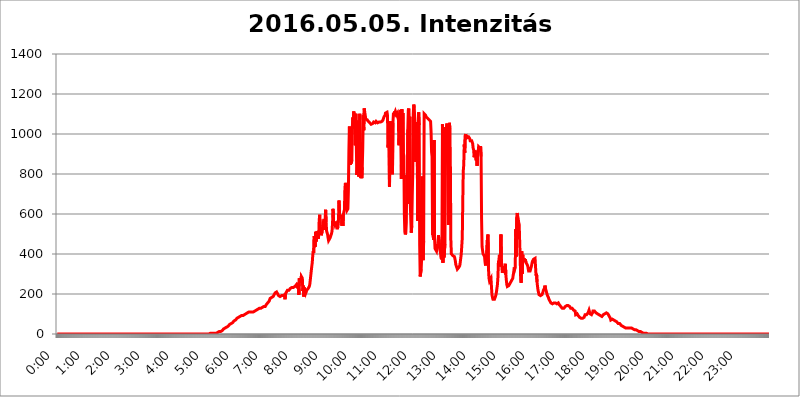
| Category | 2016.05.05. Intenzitás [W/m^2] |
|---|---|
| 0.0 | 0 |
| 0.0006944444444444445 | 0 |
| 0.001388888888888889 | 0 |
| 0.0020833333333333333 | 0 |
| 0.002777777777777778 | 0 |
| 0.003472222222222222 | 0 |
| 0.004166666666666667 | 0 |
| 0.004861111111111111 | 0 |
| 0.005555555555555556 | 0 |
| 0.0062499999999999995 | 0 |
| 0.006944444444444444 | 0 |
| 0.007638888888888889 | 0 |
| 0.008333333333333333 | 0 |
| 0.009027777777777779 | 0 |
| 0.009722222222222222 | 0 |
| 0.010416666666666666 | 0 |
| 0.011111111111111112 | 0 |
| 0.011805555555555555 | 0 |
| 0.012499999999999999 | 0 |
| 0.013194444444444444 | 0 |
| 0.013888888888888888 | 0 |
| 0.014583333333333332 | 0 |
| 0.015277777777777777 | 0 |
| 0.015972222222222224 | 0 |
| 0.016666666666666666 | 0 |
| 0.017361111111111112 | 0 |
| 0.018055555555555557 | 0 |
| 0.01875 | 0 |
| 0.019444444444444445 | 0 |
| 0.02013888888888889 | 0 |
| 0.020833333333333332 | 0 |
| 0.02152777777777778 | 0 |
| 0.022222222222222223 | 0 |
| 0.02291666666666667 | 0 |
| 0.02361111111111111 | 0 |
| 0.024305555555555556 | 0 |
| 0.024999999999999998 | 0 |
| 0.025694444444444447 | 0 |
| 0.02638888888888889 | 0 |
| 0.027083333333333334 | 0 |
| 0.027777777777777776 | 0 |
| 0.02847222222222222 | 0 |
| 0.029166666666666664 | 0 |
| 0.029861111111111113 | 0 |
| 0.030555555555555555 | 0 |
| 0.03125 | 0 |
| 0.03194444444444445 | 0 |
| 0.03263888888888889 | 0 |
| 0.03333333333333333 | 0 |
| 0.034027777777777775 | 0 |
| 0.034722222222222224 | 0 |
| 0.035416666666666666 | 0 |
| 0.036111111111111115 | 0 |
| 0.03680555555555556 | 0 |
| 0.0375 | 0 |
| 0.03819444444444444 | 0 |
| 0.03888888888888889 | 0 |
| 0.03958333333333333 | 0 |
| 0.04027777777777778 | 0 |
| 0.04097222222222222 | 0 |
| 0.041666666666666664 | 0 |
| 0.042361111111111106 | 0 |
| 0.04305555555555556 | 0 |
| 0.043750000000000004 | 0 |
| 0.044444444444444446 | 0 |
| 0.04513888888888889 | 0 |
| 0.04583333333333334 | 0 |
| 0.04652777777777778 | 0 |
| 0.04722222222222222 | 0 |
| 0.04791666666666666 | 0 |
| 0.04861111111111111 | 0 |
| 0.049305555555555554 | 0 |
| 0.049999999999999996 | 0 |
| 0.05069444444444445 | 0 |
| 0.051388888888888894 | 0 |
| 0.052083333333333336 | 0 |
| 0.05277777777777778 | 0 |
| 0.05347222222222222 | 0 |
| 0.05416666666666667 | 0 |
| 0.05486111111111111 | 0 |
| 0.05555555555555555 | 0 |
| 0.05625 | 0 |
| 0.05694444444444444 | 0 |
| 0.057638888888888885 | 0 |
| 0.05833333333333333 | 0 |
| 0.05902777777777778 | 0 |
| 0.059722222222222225 | 0 |
| 0.06041666666666667 | 0 |
| 0.061111111111111116 | 0 |
| 0.06180555555555556 | 0 |
| 0.0625 | 0 |
| 0.06319444444444444 | 0 |
| 0.06388888888888888 | 0 |
| 0.06458333333333334 | 0 |
| 0.06527777777777778 | 0 |
| 0.06597222222222222 | 0 |
| 0.06666666666666667 | 0 |
| 0.06736111111111111 | 0 |
| 0.06805555555555555 | 0 |
| 0.06874999999999999 | 0 |
| 0.06944444444444443 | 0 |
| 0.07013888888888889 | 0 |
| 0.07083333333333333 | 0 |
| 0.07152777777777779 | 0 |
| 0.07222222222222223 | 0 |
| 0.07291666666666667 | 0 |
| 0.07361111111111111 | 0 |
| 0.07430555555555556 | 0 |
| 0.075 | 0 |
| 0.07569444444444444 | 0 |
| 0.0763888888888889 | 0 |
| 0.07708333333333334 | 0 |
| 0.07777777777777778 | 0 |
| 0.07847222222222222 | 0 |
| 0.07916666666666666 | 0 |
| 0.0798611111111111 | 0 |
| 0.08055555555555556 | 0 |
| 0.08125 | 0 |
| 0.08194444444444444 | 0 |
| 0.08263888888888889 | 0 |
| 0.08333333333333333 | 0 |
| 0.08402777777777777 | 0 |
| 0.08472222222222221 | 0 |
| 0.08541666666666665 | 0 |
| 0.08611111111111112 | 0 |
| 0.08680555555555557 | 0 |
| 0.08750000000000001 | 0 |
| 0.08819444444444445 | 0 |
| 0.08888888888888889 | 0 |
| 0.08958333333333333 | 0 |
| 0.09027777777777778 | 0 |
| 0.09097222222222222 | 0 |
| 0.09166666666666667 | 0 |
| 0.09236111111111112 | 0 |
| 0.09305555555555556 | 0 |
| 0.09375 | 0 |
| 0.09444444444444444 | 0 |
| 0.09513888888888888 | 0 |
| 0.09583333333333333 | 0 |
| 0.09652777777777777 | 0 |
| 0.09722222222222222 | 0 |
| 0.09791666666666667 | 0 |
| 0.09861111111111111 | 0 |
| 0.09930555555555555 | 0 |
| 0.09999999999999999 | 0 |
| 0.10069444444444443 | 0 |
| 0.1013888888888889 | 0 |
| 0.10208333333333335 | 0 |
| 0.10277777777777779 | 0 |
| 0.10347222222222223 | 0 |
| 0.10416666666666667 | 0 |
| 0.10486111111111111 | 0 |
| 0.10555555555555556 | 0 |
| 0.10625 | 0 |
| 0.10694444444444444 | 0 |
| 0.1076388888888889 | 0 |
| 0.10833333333333334 | 0 |
| 0.10902777777777778 | 0 |
| 0.10972222222222222 | 0 |
| 0.1111111111111111 | 0 |
| 0.11180555555555556 | 0 |
| 0.11180555555555556 | 0 |
| 0.1125 | 0 |
| 0.11319444444444444 | 0 |
| 0.11388888888888889 | 0 |
| 0.11458333333333333 | 0 |
| 0.11527777777777777 | 0 |
| 0.11597222222222221 | 0 |
| 0.11666666666666665 | 0 |
| 0.1173611111111111 | 0 |
| 0.11805555555555557 | 0 |
| 0.11944444444444445 | 0 |
| 0.12013888888888889 | 0 |
| 0.12083333333333333 | 0 |
| 0.12152777777777778 | 0 |
| 0.12222222222222223 | 0 |
| 0.12291666666666667 | 0 |
| 0.12291666666666667 | 0 |
| 0.12361111111111112 | 0 |
| 0.12430555555555556 | 0 |
| 0.125 | 0 |
| 0.12569444444444444 | 0 |
| 0.12638888888888888 | 0 |
| 0.12708333333333333 | 0 |
| 0.16875 | 0 |
| 0.12847222222222224 | 0 |
| 0.12916666666666668 | 0 |
| 0.12986111111111112 | 0 |
| 0.13055555555555556 | 0 |
| 0.13125 | 0 |
| 0.13194444444444445 | 0 |
| 0.1326388888888889 | 0 |
| 0.13333333333333333 | 0 |
| 0.13402777777777777 | 0 |
| 0.13402777777777777 | 0 |
| 0.13472222222222222 | 0 |
| 0.13541666666666666 | 0 |
| 0.1361111111111111 | 0 |
| 0.13749999999999998 | 0 |
| 0.13819444444444443 | 0 |
| 0.1388888888888889 | 0 |
| 0.13958333333333334 | 0 |
| 0.14027777777777778 | 0 |
| 0.14097222222222222 | 0 |
| 0.14166666666666666 | 0 |
| 0.1423611111111111 | 0 |
| 0.14305555555555557 | 0 |
| 0.14375000000000002 | 0 |
| 0.14444444444444446 | 0 |
| 0.1451388888888889 | 0 |
| 0.1451388888888889 | 0 |
| 0.14652777777777778 | 0 |
| 0.14722222222222223 | 0 |
| 0.14791666666666667 | 0 |
| 0.1486111111111111 | 0 |
| 0.14930555555555555 | 0 |
| 0.15 | 0 |
| 0.15069444444444444 | 0 |
| 0.15138888888888888 | 0 |
| 0.15208333333333332 | 0 |
| 0.15277777777777776 | 0 |
| 0.15347222222222223 | 0 |
| 0.15416666666666667 | 0 |
| 0.15486111111111112 | 0 |
| 0.15555555555555556 | 0 |
| 0.15625 | 0 |
| 0.15694444444444444 | 0 |
| 0.15763888888888888 | 0 |
| 0.15833333333333333 | 0 |
| 0.15902777777777777 | 0 |
| 0.15972222222222224 | 0 |
| 0.16041666666666668 | 0 |
| 0.16111111111111112 | 0 |
| 0.16180555555555556 | 0 |
| 0.1625 | 0 |
| 0.16319444444444445 | 0 |
| 0.1638888888888889 | 0 |
| 0.16458333333333333 | 0 |
| 0.16527777777777777 | 0 |
| 0.16597222222222222 | 0 |
| 0.16666666666666666 | 0 |
| 0.1673611111111111 | 0 |
| 0.16805555555555554 | 0 |
| 0.16874999999999998 | 0 |
| 0.16944444444444443 | 0 |
| 0.17013888888888887 | 0 |
| 0.1708333333333333 | 0 |
| 0.17152777777777775 | 0 |
| 0.17222222222222225 | 0 |
| 0.1729166666666667 | 0 |
| 0.17361111111111113 | 0 |
| 0.17430555555555557 | 0 |
| 0.17500000000000002 | 0 |
| 0.17569444444444446 | 0 |
| 0.1763888888888889 | 0 |
| 0.17708333333333334 | 0 |
| 0.17777777777777778 | 0 |
| 0.17847222222222223 | 0 |
| 0.17916666666666667 | 0 |
| 0.1798611111111111 | 0 |
| 0.18055555555555555 | 0 |
| 0.18125 | 0 |
| 0.18194444444444444 | 0 |
| 0.1826388888888889 | 0 |
| 0.18333333333333335 | 0 |
| 0.1840277777777778 | 0 |
| 0.18472222222222223 | 0 |
| 0.18541666666666667 | 0 |
| 0.18611111111111112 | 0 |
| 0.18680555555555556 | 0 |
| 0.1875 | 0 |
| 0.18819444444444444 | 0 |
| 0.18888888888888888 | 0 |
| 0.18958333333333333 | 0 |
| 0.19027777777777777 | 0 |
| 0.1909722222222222 | 0 |
| 0.19166666666666665 | 0 |
| 0.19236111111111112 | 0 |
| 0.19305555555555554 | 0 |
| 0.19375 | 0 |
| 0.19444444444444445 | 0 |
| 0.1951388888888889 | 0 |
| 0.19583333333333333 | 0 |
| 0.19652777777777777 | 0 |
| 0.19722222222222222 | 0 |
| 0.19791666666666666 | 0 |
| 0.1986111111111111 | 0 |
| 0.19930555555555554 | 0 |
| 0.19999999999999998 | 0 |
| 0.20069444444444443 | 0 |
| 0.20138888888888887 | 0 |
| 0.2020833333333333 | 0 |
| 0.2027777777777778 | 0 |
| 0.2034722222222222 | 0 |
| 0.2041666666666667 | 0 |
| 0.20486111111111113 | 0 |
| 0.20555555555555557 | 0 |
| 0.20625000000000002 | 0 |
| 0.20694444444444446 | 0 |
| 0.2076388888888889 | 0 |
| 0.20833333333333334 | 0 |
| 0.20902777777777778 | 0 |
| 0.20972222222222223 | 0 |
| 0.21041666666666667 | 0 |
| 0.2111111111111111 | 0 |
| 0.21180555555555555 | 0 |
| 0.2125 | 0 |
| 0.21319444444444444 | 0 |
| 0.2138888888888889 | 3.525 |
| 0.21458333333333335 | 3.525 |
| 0.2152777777777778 | 3.525 |
| 0.21597222222222223 | 3.525 |
| 0.21666666666666667 | 3.525 |
| 0.21736111111111112 | 3.525 |
| 0.21805555555555556 | 0 |
| 0.21875 | 3.525 |
| 0.21944444444444444 | 0 |
| 0.22013888888888888 | 3.525 |
| 0.22083333333333333 | 3.525 |
| 0.22152777777777777 | 3.525 |
| 0.2222222222222222 | 3.525 |
| 0.22291666666666665 | 3.525 |
| 0.2236111111111111 | 7.887 |
| 0.22430555555555556 | 7.887 |
| 0.225 | 7.887 |
| 0.22569444444444445 | 7.887 |
| 0.2263888888888889 | 7.887 |
| 0.22708333333333333 | 12.257 |
| 0.22777777777777777 | 12.257 |
| 0.22847222222222222 | 12.257 |
| 0.22916666666666666 | 12.257 |
| 0.2298611111111111 | 16.636 |
| 0.23055555555555554 | 16.636 |
| 0.23124999999999998 | 16.636 |
| 0.23194444444444443 | 21.024 |
| 0.23263888888888887 | 21.024 |
| 0.2333333333333333 | 25.419 |
| 0.2340277777777778 | 25.419 |
| 0.2347222222222222 | 29.823 |
| 0.2354166666666667 | 29.823 |
| 0.23611111111111113 | 29.823 |
| 0.23680555555555557 | 34.234 |
| 0.23750000000000002 | 34.234 |
| 0.23819444444444446 | 34.234 |
| 0.2388888888888889 | 34.234 |
| 0.23958333333333334 | 38.653 |
| 0.24027777777777778 | 38.653 |
| 0.24097222222222223 | 43.079 |
| 0.24166666666666667 | 47.511 |
| 0.2423611111111111 | 47.511 |
| 0.24305555555555555 | 47.511 |
| 0.24375 | 51.951 |
| 0.24444444444444446 | 51.951 |
| 0.24513888888888888 | 56.398 |
| 0.24583333333333335 | 56.398 |
| 0.2465277777777778 | 56.398 |
| 0.24722222222222223 | 60.85 |
| 0.24791666666666667 | 65.31 |
| 0.24861111111111112 | 65.31 |
| 0.24930555555555556 | 69.775 |
| 0.25 | 69.775 |
| 0.25069444444444444 | 74.246 |
| 0.2513888888888889 | 74.246 |
| 0.2520833333333333 | 78.722 |
| 0.25277777777777777 | 78.722 |
| 0.2534722222222222 | 83.205 |
| 0.25416666666666665 | 83.205 |
| 0.2548611111111111 | 83.205 |
| 0.2555555555555556 | 87.692 |
| 0.25625000000000003 | 87.692 |
| 0.2569444444444445 | 87.692 |
| 0.2576388888888889 | 87.692 |
| 0.25833333333333336 | 92.184 |
| 0.2590277777777778 | 92.184 |
| 0.25972222222222224 | 92.184 |
| 0.2604166666666667 | 92.184 |
| 0.2611111111111111 | 92.184 |
| 0.26180555555555557 | 92.184 |
| 0.2625 | 96.682 |
| 0.26319444444444445 | 96.682 |
| 0.2638888888888889 | 101.184 |
| 0.26458333333333334 | 101.184 |
| 0.2652777777777778 | 101.184 |
| 0.2659722222222222 | 105.69 |
| 0.26666666666666666 | 105.69 |
| 0.2673611111111111 | 105.69 |
| 0.26805555555555555 | 105.69 |
| 0.26875 | 110.201 |
| 0.26944444444444443 | 110.201 |
| 0.2701388888888889 | 110.201 |
| 0.2708333333333333 | 110.201 |
| 0.27152777777777776 | 110.201 |
| 0.2722222222222222 | 110.201 |
| 0.27291666666666664 | 110.201 |
| 0.2736111111111111 | 110.201 |
| 0.2743055555555555 | 110.201 |
| 0.27499999999999997 | 110.201 |
| 0.27569444444444446 | 110.201 |
| 0.27638888888888885 | 114.716 |
| 0.27708333333333335 | 114.716 |
| 0.2777777777777778 | 114.716 |
| 0.27847222222222223 | 114.716 |
| 0.2791666666666667 | 119.235 |
| 0.2798611111111111 | 119.235 |
| 0.28055555555555556 | 119.235 |
| 0.28125 | 123.758 |
| 0.28194444444444444 | 123.758 |
| 0.2826388888888889 | 128.284 |
| 0.2833333333333333 | 128.284 |
| 0.28402777777777777 | 128.284 |
| 0.2847222222222222 | 128.284 |
| 0.28541666666666665 | 128.284 |
| 0.28611111111111115 | 132.814 |
| 0.28680555555555554 | 132.814 |
| 0.28750000000000003 | 132.814 |
| 0.2881944444444445 | 132.814 |
| 0.2888888888888889 | 137.347 |
| 0.28958333333333336 | 137.347 |
| 0.2902777777777778 | 137.347 |
| 0.29097222222222224 | 132.814 |
| 0.2916666666666667 | 137.347 |
| 0.2923611111111111 | 141.884 |
| 0.29305555555555557 | 146.423 |
| 0.29375 | 146.423 |
| 0.29444444444444445 | 150.964 |
| 0.2951388888888889 | 155.509 |
| 0.29583333333333334 | 155.509 |
| 0.2965277777777778 | 160.056 |
| 0.2972222222222222 | 164.605 |
| 0.29791666666666666 | 169.156 |
| 0.2986111111111111 | 178.264 |
| 0.29930555555555555 | 178.264 |
| 0.3 | 182.82 |
| 0.30069444444444443 | 182.82 |
| 0.3013888888888889 | 182.82 |
| 0.3020833333333333 | 187.378 |
| 0.30277777777777776 | 187.378 |
| 0.3034722222222222 | 191.937 |
| 0.30416666666666664 | 196.497 |
| 0.3048611111111111 | 201.058 |
| 0.3055555555555555 | 205.62 |
| 0.30624999999999997 | 210.182 |
| 0.3069444444444444 | 210.182 |
| 0.3076388888888889 | 210.182 |
| 0.30833333333333335 | 205.62 |
| 0.3090277777777778 | 201.058 |
| 0.30972222222222223 | 196.497 |
| 0.3104166666666667 | 191.937 |
| 0.3111111111111111 | 191.937 |
| 0.31180555555555556 | 191.937 |
| 0.3125 | 187.378 |
| 0.31319444444444444 | 187.378 |
| 0.3138888888888889 | 191.937 |
| 0.3145833333333333 | 191.937 |
| 0.31527777777777777 | 191.937 |
| 0.3159722222222222 | 191.937 |
| 0.31666666666666665 | 191.937 |
| 0.31736111111111115 | 191.937 |
| 0.31805555555555554 | 196.497 |
| 0.31875000000000003 | 196.497 |
| 0.3194444444444445 | 173.709 |
| 0.3201388888888889 | 201.058 |
| 0.32083333333333336 | 205.62 |
| 0.3215277777777778 | 210.182 |
| 0.32222222222222224 | 214.746 |
| 0.3229166666666667 | 219.309 |
| 0.3236111111111111 | 219.309 |
| 0.32430555555555557 | 219.309 |
| 0.325 | 219.309 |
| 0.32569444444444445 | 219.309 |
| 0.3263888888888889 | 223.873 |
| 0.32708333333333334 | 228.436 |
| 0.3277777777777778 | 233 |
| 0.3284722222222222 | 233 |
| 0.32916666666666666 | 233 |
| 0.3298611111111111 | 233 |
| 0.33055555555555555 | 233 |
| 0.33125 | 233 |
| 0.33194444444444443 | 233 |
| 0.3326388888888889 | 233 |
| 0.3333333333333333 | 237.564 |
| 0.3340277777777778 | 242.127 |
| 0.3347222222222222 | 242.127 |
| 0.3354166666666667 | 246.689 |
| 0.3361111111111111 | 251.251 |
| 0.3368055555555556 | 251.251 |
| 0.33749999999999997 | 228.436 |
| 0.33819444444444446 | 255.813 |
| 0.33888888888888885 | 196.497 |
| 0.33958333333333335 | 278.603 |
| 0.34027777777777773 | 283.156 |
| 0.34097222222222223 | 278.603 |
| 0.3416666666666666 | 255.813 |
| 0.3423611111111111 | 287.709 |
| 0.3430555555555555 | 287.709 |
| 0.34375 | 278.603 |
| 0.3444444444444445 | 214.746 |
| 0.3451388888888889 | 242.127 |
| 0.3458333333333334 | 187.378 |
| 0.34652777777777777 | 233 |
| 0.34722222222222227 | 201.058 |
| 0.34791666666666665 | 219.309 |
| 0.34861111111111115 | 205.62 |
| 0.34930555555555554 | 210.182 |
| 0.35000000000000003 | 219.309 |
| 0.3506944444444444 | 219.309 |
| 0.3513888888888889 | 223.873 |
| 0.3520833333333333 | 228.436 |
| 0.3527777777777778 | 228.436 |
| 0.3534722222222222 | 237.564 |
| 0.3541666666666667 | 246.689 |
| 0.3548611111111111 | 269.49 |
| 0.35555555555555557 | 292.259 |
| 0.35625 | 314.98 |
| 0.35694444444444445 | 337.639 |
| 0.3576388888888889 | 355.712 |
| 0.35833333333333334 | 391.685 |
| 0.3590277777777778 | 414.035 |
| 0.3597222222222222 | 405.108 |
| 0.36041666666666666 | 489.108 |
| 0.3611111111111111 | 471.582 |
| 0.36180555555555555 | 436.27 |
| 0.3625 | 510.885 |
| 0.36319444444444443 | 462.786 |
| 0.3638888888888889 | 484.735 |
| 0.3645833333333333 | 515.223 |
| 0.3652777777777778 | 497.836 |
| 0.3659722222222222 | 475.972 |
| 0.3666666666666667 | 489.108 |
| 0.3673611111111111 | 566.793 |
| 0.3680555555555556 | 596.45 |
| 0.36874999999999997 | 541.121 |
| 0.36944444444444446 | 528.2 |
| 0.37013888888888885 | 493.475 |
| 0.37083333333333335 | 497.836 |
| 0.37152777777777773 | 510.885 |
| 0.37222222222222223 | 515.223 |
| 0.3729166666666666 | 558.261 |
| 0.3736111111111111 | 562.53 |
| 0.3743055555555555 | 575.299 |
| 0.375 | 519.555 |
| 0.3756944444444445 | 571.049 |
| 0.3763888888888889 | 621.613 |
| 0.3770833333333334 | 558.261 |
| 0.37777777777777777 | 515.223 |
| 0.37847222222222227 | 515.223 |
| 0.37916666666666665 | 497.836 |
| 0.37986111111111115 | 480.356 |
| 0.38055555555555554 | 467.187 |
| 0.38125000000000003 | 462.786 |
| 0.3819444444444444 | 471.582 |
| 0.3826388888888889 | 480.356 |
| 0.3833333333333333 | 484.735 |
| 0.3840277777777778 | 484.735 |
| 0.3847222222222222 | 502.192 |
| 0.3854166666666667 | 515.223 |
| 0.3861111111111111 | 553.986 |
| 0.38680555555555557 | 625.784 |
| 0.3875 | 562.53 |
| 0.38819444444444445 | 558.261 |
| 0.3888888888888889 | 553.986 |
| 0.38958333333333334 | 545.416 |
| 0.3902777777777778 | 541.121 |
| 0.3909722222222222 | 562.53 |
| 0.39166666666666666 | 566.793 |
| 0.3923611111111111 | 541.121 |
| 0.39305555555555555 | 523.88 |
| 0.39375 | 523.88 |
| 0.39444444444444443 | 575.299 |
| 0.3951388888888889 | 667.123 |
| 0.3958333333333333 | 604.864 |
| 0.3965277777777778 | 575.299 |
| 0.3972222222222222 | 592.233 |
| 0.3979166666666667 | 575.299 |
| 0.3986111111111111 | 596.45 |
| 0.3993055555555556 | 541.121 |
| 0.39999999999999997 | 571.049 |
| 0.40069444444444446 | 541.121 |
| 0.40138888888888885 | 600.661 |
| 0.40208333333333335 | 596.45 |
| 0.40277777777777773 | 621.613 |
| 0.40347222222222223 | 727.896 |
| 0.4041666666666666 | 755.766 |
| 0.4048611111111111 | 731.896 |
| 0.4055555555555555 | 629.948 |
| 0.40625 | 617.436 |
| 0.4069444444444445 | 617.436 |
| 0.4076388888888889 | 625.784 |
| 0.4083333333333334 | 715.858 |
| 0.40902777777777777 | 913.766 |
| 0.40972222222222227 | 1037.277 |
| 0.41041666666666665 | 932.576 |
| 0.41111111111111115 | 845.365 |
| 0.41180555555555554 | 940.082 |
| 0.41250000000000003 | 853.029 |
| 0.4131944444444444 | 872.114 |
| 0.4138888888888889 | 1037.277 |
| 0.4145833333333333 | 1082.324 |
| 0.4152777777777778 | 1026.06 |
| 0.4159722222222222 | 1112.618 |
| 0.4166666666666667 | 1044.762 |
| 0.4173611111111111 | 1086.097 |
| 0.41805555555555557 | 943.832 |
| 0.41875 | 1101.226 |
| 0.41944444444444445 | 947.58 |
| 0.4201388888888889 | 795.074 |
| 0.42083333333333334 | 833.834 |
| 0.4215277777777778 | 1026.06 |
| 0.4222222222222222 | 1067.267 |
| 0.42291666666666666 | 787.258 |
| 0.4236111111111111 | 973.772 |
| 0.42430555555555555 | 1101.226 |
| 0.425 | 943.832 |
| 0.42569444444444443 | 779.42 |
| 0.4263888888888889 | 958.814 |
| 0.4270833333333333 | 779.42 |
| 0.4277777777777778 | 833.834 |
| 0.4284722222222222 | 928.819 |
| 0.4291666666666667 | 1093.653 |
| 0.4298611111111111 | 1018.587 |
| 0.4305555555555556 | 1127.879 |
| 0.43124999999999997 | 1108.816 |
| 0.43194444444444446 | 1093.653 |
| 0.43263888888888885 | 1074.789 |
| 0.43333333333333335 | 1078.555 |
| 0.43402777777777773 | 1071.027 |
| 0.43472222222222223 | 1071.027 |
| 0.4354166666666666 | 1067.267 |
| 0.4361111111111111 | 1063.51 |
| 0.4368055555555555 | 1059.756 |
| 0.4375 | 1059.756 |
| 0.4381944444444445 | 1056.004 |
| 0.4388888888888889 | 1059.756 |
| 0.4395833333333334 | 1056.004 |
| 0.44027777777777777 | 1048.508 |
| 0.44097222222222227 | 1044.762 |
| 0.44166666666666665 | 1048.508 |
| 0.44236111111111115 | 1052.255 |
| 0.44305555555555554 | 1056.004 |
| 0.44375000000000003 | 1059.756 |
| 0.4444444444444444 | 1059.756 |
| 0.4451388888888889 | 1059.756 |
| 0.4458333333333333 | 1056.004 |
| 0.4465277777777778 | 1059.756 |
| 0.4472222222222222 | 1063.51 |
| 0.4479166666666667 | 1059.756 |
| 0.4486111111111111 | 1059.756 |
| 0.44930555555555557 | 1056.004 |
| 0.45 | 1056.004 |
| 0.45069444444444445 | 1059.756 |
| 0.4513888888888889 | 1059.756 |
| 0.45208333333333334 | 1059.756 |
| 0.4527777777777778 | 1059.756 |
| 0.4534722222222222 | 1059.756 |
| 0.45416666666666666 | 1059.756 |
| 0.4548611111111111 | 1059.756 |
| 0.45555555555555555 | 1063.51 |
| 0.45625 | 1063.51 |
| 0.45694444444444443 | 1071.027 |
| 0.4576388888888889 | 1078.555 |
| 0.4583333333333333 | 1086.097 |
| 0.4590277777777778 | 1089.873 |
| 0.4597222222222222 | 1093.653 |
| 0.4604166666666667 | 1105.019 |
| 0.4611111111111111 | 1108.816 |
| 0.4618055555555556 | 1108.816 |
| 0.46249999999999997 | 1108.816 |
| 0.46319444444444446 | 1093.653 |
| 0.46388888888888885 | 932.576 |
| 0.46458333333333335 | 984.98 |
| 0.46527777777777773 | 1011.118 |
| 0.46597222222222223 | 735.89 |
| 0.4666666666666666 | 955.071 |
| 0.4673611111111111 | 1063.51 |
| 0.4680555555555555 | 999.916 |
| 0.46875 | 1007.383 |
| 0.4694444444444445 | 1048.508 |
| 0.4701388888888889 | 798.974 |
| 0.4708333333333334 | 1056.004 |
| 0.47152777777777777 | 1105.019 |
| 0.47222222222222227 | 1089.873 |
| 0.47291666666666665 | 1112.618 |
| 0.47361111111111115 | 1105.019 |
| 0.47430555555555554 | 1112.618 |
| 0.47500000000000003 | 1108.816 |
| 0.4756944444444444 | 1097.437 |
| 0.4763888888888889 | 1101.226 |
| 0.4770833333333333 | 1105.019 |
| 0.4777777777777778 | 1082.324 |
| 0.4784722222222222 | 1071.027 |
| 0.4791666666666667 | 943.832 |
| 0.4798611111111111 | 1014.852 |
| 0.48055555555555557 | 1108.816 |
| 0.48125 | 1120.238 |
| 0.48194444444444445 | 951.327 |
| 0.4826388888888889 | 775.492 |
| 0.48333333333333334 | 1124.056 |
| 0.4840277777777778 | 894.885 |
| 0.4847222222222222 | 1105.019 |
| 0.48541666666666666 | 906.223 |
| 0.4861111111111111 | 891.099 |
| 0.48680555555555555 | 600.661 |
| 0.4875 | 510.885 |
| 0.48819444444444443 | 497.836 |
| 0.4888888888888889 | 506.542 |
| 0.4895833333333333 | 558.261 |
| 0.4902777777777778 | 795.074 |
| 0.4909722222222222 | 650.667 |
| 0.4916666666666667 | 1022.323 |
| 0.4923611111111111 | 1120.238 |
| 0.4930555555555556 | 1127.879 |
| 0.49374999999999997 | 887.309 |
| 0.49444444444444446 | 1086.097 |
| 0.49513888888888885 | 654.791 |
| 0.49583333333333335 | 575.299 |
| 0.49652777777777773 | 506.542 |
| 0.49722222222222223 | 541.121 |
| 0.4979166666666666 | 691.608 |
| 0.4986111111111111 | 806.757 |
| 0.4993055555555555 | 1101.226 |
| 0.5 | 1147.086 |
| 0.5006944444444444 | 1131.708 |
| 0.5013888888888889 | 1078.555 |
| 0.5020833333333333 | 917.534 |
| 0.5027777777777778 | 860.676 |
| 0.5034722222222222 | 1059.756 |
| 0.5041666666666667 | 996.182 |
| 0.5048611111111111 | 1022.323 |
| 0.5055555555555555 | 566.793 |
| 0.50625 | 1059.756 |
| 0.5069444444444444 | 1108.816 |
| 0.5076388888888889 | 1044.762 |
| 0.5083333333333333 | 440.702 |
| 0.5090277777777777 | 287.709 |
| 0.5097222222222222 | 292.259 |
| 0.5104166666666666 | 324.052 |
| 0.5111111111111112 | 382.715 |
| 0.5118055555555555 | 787.258 |
| 0.5125000000000001 | 449.551 |
| 0.5131944444444444 | 369.23 |
| 0.513888888888889 | 462.786 |
| 0.5145833333333333 | 1101.226 |
| 0.5152777777777778 | 1101.226 |
| 0.5159722222222222 | 1097.437 |
| 0.5166666666666667 | 1093.653 |
| 0.517361111111111 | 1086.097 |
| 0.5180555555555556 | 1086.097 |
| 0.5187499999999999 | 1082.324 |
| 0.5194444444444445 | 1078.555 |
| 0.5201388888888888 | 1074.789 |
| 0.5208333333333334 | 1074.789 |
| 0.5215277777777778 | 1071.027 |
| 0.5222222222222223 | 1071.027 |
| 0.5229166666666667 | 1074.789 |
| 0.5236111111111111 | 1063.51 |
| 0.5243055555555556 | 1011.118 |
| 0.525 | 909.996 |
| 0.5256944444444445 | 887.309 |
| 0.5263888888888889 | 493.475 |
| 0.5270833333333333 | 502.192 |
| 0.5277777777777778 | 471.582 |
| 0.5284722222222222 | 970.034 |
| 0.5291666666666667 | 480.356 |
| 0.5298611111111111 | 427.39 |
| 0.5305555555555556 | 431.833 |
| 0.53125 | 422.943 |
| 0.5319444444444444 | 414.035 |
| 0.5326388888888889 | 431.833 |
| 0.5333333333333333 | 436.27 |
| 0.5340277777777778 | 453.968 |
| 0.5347222222222222 | 493.475 |
| 0.5354166666666667 | 489.108 |
| 0.5361111111111111 | 431.833 |
| 0.5368055555555555 | 418.492 |
| 0.5375 | 405.108 |
| 0.5381944444444444 | 382.715 |
| 0.5388888888888889 | 373.729 |
| 0.5395833333333333 | 475.972 |
| 0.5402777777777777 | 1048.508 |
| 0.5409722222222222 | 355.712 |
| 0.5416666666666666 | 1033.537 |
| 0.5423611111111112 | 382.715 |
| 0.5430555555555555 | 378.224 |
| 0.5437500000000001 | 449.551 |
| 0.5444444444444444 | 970.034 |
| 0.545138888888889 | 992.448 |
| 0.5458333333333333 | 1029.798 |
| 0.5465277777777778 | 1052.255 |
| 0.5472222222222222 | 879.719 |
| 0.5479166666666667 | 787.258 |
| 0.548611111111111 | 545.416 |
| 0.5493055555555556 | 650.667 |
| 0.5499999999999999 | 1056.004 |
| 0.5506944444444445 | 1026.06 |
| 0.5513888888888888 | 833.834 |
| 0.5520833333333334 | 462.786 |
| 0.5527777777777778 | 400.638 |
| 0.5534722222222223 | 400.638 |
| 0.5541666666666667 | 396.164 |
| 0.5548611111111111 | 391.685 |
| 0.5555555555555556 | 391.685 |
| 0.55625 | 396.164 |
| 0.5569444444444445 | 387.202 |
| 0.5576388888888889 | 378.224 |
| 0.5583333333333333 | 364.728 |
| 0.5590277777777778 | 346.682 |
| 0.5597222222222222 | 342.162 |
| 0.5604166666666667 | 342.162 |
| 0.5611111111111111 | 324.052 |
| 0.5618055555555556 | 324.052 |
| 0.5625 | 324.052 |
| 0.5631944444444444 | 333.113 |
| 0.5638888888888889 | 333.113 |
| 0.5645833333333333 | 342.162 |
| 0.5652777777777778 | 360.221 |
| 0.5659722222222222 | 360.221 |
| 0.5666666666666667 | 400.638 |
| 0.5673611111111111 | 440.702 |
| 0.5680555555555555 | 480.356 |
| 0.56875 | 658.909 |
| 0.5694444444444444 | 814.519 |
| 0.5701388888888889 | 845.365 |
| 0.5708333333333333 | 947.58 |
| 0.5715277777777777 | 906.223 |
| 0.5722222222222222 | 992.448 |
| 0.5729166666666666 | 999.916 |
| 0.5736111111111112 | 977.508 |
| 0.5743055555555555 | 992.448 |
| 0.5750000000000001 | 981.244 |
| 0.5756944444444444 | 984.98 |
| 0.576388888888889 | 977.508 |
| 0.5770833333333333 | 984.98 |
| 0.5777777777777778 | 981.244 |
| 0.5784722222222222 | 977.508 |
| 0.5791666666666667 | 966.295 |
| 0.579861111111111 | 970.034 |
| 0.5805555555555556 | 970.034 |
| 0.5812499999999999 | 966.295 |
| 0.5819444444444445 | 958.814 |
| 0.5826388888888888 | 951.327 |
| 0.5833333333333334 | 928.819 |
| 0.5840277777777778 | 921.298 |
| 0.5847222222222223 | 883.516 |
| 0.5854166666666667 | 879.719 |
| 0.5861111111111111 | 917.534 |
| 0.5868055555555556 | 887.309 |
| 0.5875 | 868.305 |
| 0.5881944444444445 | 891.099 |
| 0.5888888888888889 | 841.526 |
| 0.5895833333333333 | 894.885 |
| 0.5902777777777778 | 909.996 |
| 0.5909722222222222 | 936.33 |
| 0.5916666666666667 | 940.082 |
| 0.5923611111111111 | 936.33 |
| 0.5930555555555556 | 928.819 |
| 0.59375 | 940.082 |
| 0.5944444444444444 | 887.309 |
| 0.5951388888888889 | 575.299 |
| 0.5958333333333333 | 436.27 |
| 0.5965277777777778 | 440.702 |
| 0.5972222222222222 | 400.638 |
| 0.5979166666666667 | 396.164 |
| 0.5986111111111111 | 400.638 |
| 0.5993055555555555 | 387.202 |
| 0.6 | 360.221 |
| 0.6006944444444444 | 342.162 |
| 0.6013888888888889 | 396.164 |
| 0.6020833333333333 | 382.715 |
| 0.6027777777777777 | 378.224 |
| 0.6034722222222222 | 484.735 |
| 0.6041666666666666 | 497.836 |
| 0.6048611111111112 | 324.052 |
| 0.6055555555555555 | 278.603 |
| 0.6062500000000001 | 264.932 |
| 0.6069444444444444 | 260.373 |
| 0.607638888888889 | 260.373 |
| 0.6083333333333333 | 278.603 |
| 0.6090277777777778 | 233 |
| 0.6097222222222222 | 196.497 |
| 0.6104166666666667 | 182.82 |
| 0.611111111111111 | 173.709 |
| 0.6118055555555556 | 169.156 |
| 0.6124999999999999 | 169.156 |
| 0.6131944444444445 | 173.709 |
| 0.6138888888888888 | 178.264 |
| 0.6145833333333334 | 187.378 |
| 0.6152777777777778 | 196.497 |
| 0.6159722222222223 | 210.182 |
| 0.6166666666666667 | 228.436 |
| 0.6173611111111111 | 246.689 |
| 0.6180555555555556 | 283.156 |
| 0.61875 | 360.221 |
| 0.6194444444444445 | 369.23 |
| 0.6201388888888889 | 396.164 |
| 0.6208333333333333 | 378.224 |
| 0.6215277777777778 | 337.639 |
| 0.6222222222222222 | 497.836 |
| 0.6229166666666667 | 369.23 |
| 0.6236111111111111 | 333.113 |
| 0.6243055555555556 | 305.898 |
| 0.625 | 301.354 |
| 0.6256944444444444 | 324.052 |
| 0.6263888888888889 | 328.584 |
| 0.6270833333333333 | 314.98 |
| 0.6277777777777778 | 319.517 |
| 0.6284722222222222 | 351.198 |
| 0.6291666666666667 | 296.808 |
| 0.6298611111111111 | 269.49 |
| 0.6305555555555555 | 246.689 |
| 0.63125 | 237.564 |
| 0.6319444444444444 | 233 |
| 0.6326388888888889 | 237.564 |
| 0.6333333333333333 | 242.127 |
| 0.6340277777777777 | 242.127 |
| 0.6347222222222222 | 242.127 |
| 0.6354166666666666 | 255.813 |
| 0.6361111111111112 | 260.373 |
| 0.6368055555555555 | 260.373 |
| 0.6375000000000001 | 269.49 |
| 0.6381944444444444 | 274.047 |
| 0.638888888888889 | 278.603 |
| 0.6395833333333333 | 296.808 |
| 0.6402777777777778 | 310.44 |
| 0.6409722222222222 | 333.113 |
| 0.6416666666666667 | 324.052 |
| 0.642361111111111 | 333.113 |
| 0.6430555555555556 | 523.88 |
| 0.6437499999999999 | 387.202 |
| 0.6444444444444445 | 583.779 |
| 0.6451388888888888 | 604.864 |
| 0.6458333333333334 | 588.009 |
| 0.6465277777777778 | 575.299 |
| 0.6472222222222223 | 558.261 |
| 0.6479166666666667 | 545.416 |
| 0.6486111111111111 | 458.38 |
| 0.6493055555555556 | 378.224 |
| 0.65 | 274.047 |
| 0.6506944444444445 | 255.813 |
| 0.6513888888888889 | 414.035 |
| 0.6520833333333333 | 301.354 |
| 0.6527777777777778 | 396.164 |
| 0.6534722222222222 | 369.23 |
| 0.6541666666666667 | 360.221 |
| 0.6548611111111111 | 378.224 |
| 0.6555555555555556 | 360.221 |
| 0.65625 | 373.729 |
| 0.6569444444444444 | 369.23 |
| 0.6576388888888889 | 355.712 |
| 0.6583333333333333 | 355.712 |
| 0.6590277777777778 | 351.198 |
| 0.6597222222222222 | 342.162 |
| 0.6604166666666667 | 337.639 |
| 0.6611111111111111 | 314.98 |
| 0.6618055555555555 | 314.98 |
| 0.6625 | 310.44 |
| 0.6631944444444444 | 314.98 |
| 0.6638888888888889 | 319.517 |
| 0.6645833333333333 | 333.113 |
| 0.6652777777777777 | 342.162 |
| 0.6659722222222222 | 355.712 |
| 0.6666666666666666 | 364.728 |
| 0.6673611111111111 | 364.728 |
| 0.6680555555555556 | 373.729 |
| 0.6687500000000001 | 373.729 |
| 0.6694444444444444 | 373.729 |
| 0.6701388888888888 | 378.224 |
| 0.6708333333333334 | 373.729 |
| 0.6715277777777778 | 292.259 |
| 0.6722222222222222 | 301.354 |
| 0.6729166666666666 | 260.373 |
| 0.6736111111111112 | 237.564 |
| 0.6743055555555556 | 219.309 |
| 0.6749999999999999 | 219.309 |
| 0.6756944444444444 | 196.497 |
| 0.6763888888888889 | 191.937 |
| 0.6770833333333334 | 191.937 |
| 0.6777777777777777 | 191.937 |
| 0.6784722222222223 | 196.497 |
| 0.6791666666666667 | 196.497 |
| 0.6798611111111111 | 196.497 |
| 0.6805555555555555 | 201.058 |
| 0.68125 | 210.182 |
| 0.6819444444444445 | 219.309 |
| 0.6826388888888889 | 223.873 |
| 0.6833333333333332 | 228.436 |
| 0.6840277777777778 | 242.127 |
| 0.6847222222222222 | 228.436 |
| 0.6854166666666667 | 219.309 |
| 0.686111111111111 | 210.182 |
| 0.6868055555555556 | 201.058 |
| 0.6875 | 191.937 |
| 0.6881944444444444 | 187.378 |
| 0.688888888888889 | 182.82 |
| 0.6895833333333333 | 173.709 |
| 0.6902777777777778 | 169.156 |
| 0.6909722222222222 | 164.605 |
| 0.6916666666666668 | 160.056 |
| 0.6923611111111111 | 155.509 |
| 0.6930555555555555 | 150.964 |
| 0.69375 | 150.964 |
| 0.6944444444444445 | 150.964 |
| 0.6951388888888889 | 150.964 |
| 0.6958333333333333 | 150.964 |
| 0.6965277777777777 | 155.509 |
| 0.6972222222222223 | 150.964 |
| 0.6979166666666666 | 155.509 |
| 0.6986111111111111 | 155.509 |
| 0.6993055555555556 | 155.509 |
| 0.7000000000000001 | 155.509 |
| 0.7006944444444444 | 150.964 |
| 0.7013888888888888 | 150.964 |
| 0.7020833333333334 | 155.509 |
| 0.7027777777777778 | 155.509 |
| 0.7034722222222222 | 150.964 |
| 0.7041666666666666 | 146.423 |
| 0.7048611111111112 | 146.423 |
| 0.7055555555555556 | 141.884 |
| 0.7062499999999999 | 137.347 |
| 0.7069444444444444 | 137.347 |
| 0.7076388888888889 | 132.814 |
| 0.7083333333333334 | 128.284 |
| 0.7090277777777777 | 128.284 |
| 0.7097222222222223 | 128.284 |
| 0.7104166666666667 | 128.284 |
| 0.7111111111111111 | 128.284 |
| 0.7118055555555555 | 132.814 |
| 0.7125 | 137.347 |
| 0.7131944444444445 | 137.347 |
| 0.7138888888888889 | 141.884 |
| 0.7145833333333332 | 141.884 |
| 0.7152777777777778 | 141.884 |
| 0.7159722222222222 | 141.884 |
| 0.7166666666666667 | 141.884 |
| 0.717361111111111 | 141.884 |
| 0.7180555555555556 | 141.884 |
| 0.71875 | 137.347 |
| 0.7194444444444444 | 132.814 |
| 0.720138888888889 | 128.284 |
| 0.7208333333333333 | 128.284 |
| 0.7215277777777778 | 128.284 |
| 0.7222222222222222 | 128.284 |
| 0.7229166666666668 | 128.284 |
| 0.7236111111111111 | 123.758 |
| 0.7243055555555555 | 119.235 |
| 0.725 | 114.716 |
| 0.7256944444444445 | 114.716 |
| 0.7263888888888889 | 114.716 |
| 0.7270833333333333 | 96.682 |
| 0.7277777777777777 | 96.682 |
| 0.7284722222222223 | 101.184 |
| 0.7291666666666666 | 101.184 |
| 0.7298611111111111 | 96.682 |
| 0.7305555555555556 | 92.184 |
| 0.7312500000000001 | 92.184 |
| 0.7319444444444444 | 87.692 |
| 0.7326388888888888 | 83.205 |
| 0.7333333333333334 | 78.722 |
| 0.7340277777777778 | 78.722 |
| 0.7347222222222222 | 78.722 |
| 0.7354166666666666 | 74.246 |
| 0.7361111111111112 | 74.246 |
| 0.7368055555555556 | 78.722 |
| 0.7374999999999999 | 78.722 |
| 0.7381944444444444 | 83.205 |
| 0.7388888888888889 | 83.205 |
| 0.7395833333333334 | 87.692 |
| 0.7402777777777777 | 96.682 |
| 0.7409722222222223 | 101.184 |
| 0.7416666666666667 | 92.184 |
| 0.7423611111111111 | 96.682 |
| 0.7430555555555555 | 101.184 |
| 0.74375 | 101.184 |
| 0.7444444444444445 | 105.69 |
| 0.7451388888888889 | 105.69 |
| 0.7458333333333332 | 119.235 |
| 0.7465277777777778 | 119.235 |
| 0.7472222222222222 | 101.184 |
| 0.7479166666666667 | 96.682 |
| 0.748611111111111 | 96.682 |
| 0.7493055555555556 | 96.682 |
| 0.75 | 96.682 |
| 0.7506944444444444 | 105.69 |
| 0.751388888888889 | 114.716 |
| 0.7520833333333333 | 114.716 |
| 0.7527777777777778 | 114.716 |
| 0.7534722222222222 | 114.716 |
| 0.7541666666666668 | 110.201 |
| 0.7548611111111111 | 110.201 |
| 0.7555555555555555 | 105.69 |
| 0.75625 | 105.69 |
| 0.7569444444444445 | 101.184 |
| 0.7576388888888889 | 101.184 |
| 0.7583333333333333 | 101.184 |
| 0.7590277777777777 | 96.682 |
| 0.7597222222222223 | 96.682 |
| 0.7604166666666666 | 96.682 |
| 0.7611111111111111 | 92.184 |
| 0.7618055555555556 | 92.184 |
| 0.7625000000000001 | 92.184 |
| 0.7631944444444444 | 87.692 |
| 0.7638888888888888 | 87.692 |
| 0.7645833333333334 | 87.692 |
| 0.7652777777777778 | 92.184 |
| 0.7659722222222222 | 96.682 |
| 0.7666666666666666 | 96.682 |
| 0.7673611111111112 | 101.184 |
| 0.7680555555555556 | 101.184 |
| 0.7687499999999999 | 101.184 |
| 0.7694444444444444 | 105.69 |
| 0.7701388888888889 | 105.69 |
| 0.7708333333333334 | 101.184 |
| 0.7715277777777777 | 101.184 |
| 0.7722222222222223 | 101.184 |
| 0.7729166666666667 | 96.682 |
| 0.7736111111111111 | 92.184 |
| 0.7743055555555555 | 92.184 |
| 0.775 | 87.692 |
| 0.7756944444444445 | 78.722 |
| 0.7763888888888889 | 69.775 |
| 0.7770833333333332 | 74.246 |
| 0.7777777777777778 | 74.246 |
| 0.7784722222222222 | 74.246 |
| 0.7791666666666667 | 74.246 |
| 0.779861111111111 | 69.775 |
| 0.7805555555555556 | 69.775 |
| 0.78125 | 69.775 |
| 0.7819444444444444 | 65.31 |
| 0.782638888888889 | 65.31 |
| 0.7833333333333333 | 65.31 |
| 0.7840277777777778 | 65.31 |
| 0.7847222222222222 | 60.85 |
| 0.7854166666666668 | 56.398 |
| 0.7861111111111111 | 56.398 |
| 0.7868055555555555 | 51.951 |
| 0.7875 | 51.951 |
| 0.7881944444444445 | 51.951 |
| 0.7888888888888889 | 51.951 |
| 0.7895833333333333 | 47.511 |
| 0.7902777777777777 | 47.511 |
| 0.7909722222222223 | 43.079 |
| 0.7916666666666666 | 43.079 |
| 0.7923611111111111 | 38.653 |
| 0.7930555555555556 | 38.653 |
| 0.7937500000000001 | 38.653 |
| 0.7944444444444444 | 38.653 |
| 0.7951388888888888 | 34.234 |
| 0.7958333333333334 | 34.234 |
| 0.7965277777777778 | 34.234 |
| 0.7972222222222222 | 29.823 |
| 0.7979166666666666 | 29.823 |
| 0.7986111111111112 | 29.823 |
| 0.7993055555555556 | 29.823 |
| 0.7999999999999999 | 29.823 |
| 0.8006944444444444 | 29.823 |
| 0.8013888888888889 | 29.823 |
| 0.8020833333333334 | 29.823 |
| 0.8027777777777777 | 29.823 |
| 0.8034722222222223 | 29.823 |
| 0.8041666666666667 | 29.823 |
| 0.8048611111111111 | 29.823 |
| 0.8055555555555555 | 29.823 |
| 0.80625 | 25.419 |
| 0.8069444444444445 | 25.419 |
| 0.8076388888888889 | 25.419 |
| 0.8083333333333332 | 25.419 |
| 0.8090277777777778 | 21.024 |
| 0.8097222222222222 | 21.024 |
| 0.8104166666666667 | 21.024 |
| 0.811111111111111 | 21.024 |
| 0.8118055555555556 | 21.024 |
| 0.8125 | 16.636 |
| 0.8131944444444444 | 16.636 |
| 0.813888888888889 | 16.636 |
| 0.8145833333333333 | 12.257 |
| 0.8152777777777778 | 12.257 |
| 0.8159722222222222 | 12.257 |
| 0.8166666666666668 | 12.257 |
| 0.8173611111111111 | 12.257 |
| 0.8180555555555555 | 12.257 |
| 0.81875 | 7.887 |
| 0.8194444444444445 | 7.887 |
| 0.8201388888888889 | 7.887 |
| 0.8208333333333333 | 7.887 |
| 0.8215277777777777 | 7.887 |
| 0.8222222222222223 | 3.525 |
| 0.8229166666666666 | 3.525 |
| 0.8236111111111111 | 3.525 |
| 0.8243055555555556 | 3.525 |
| 0.8250000000000001 | 3.525 |
| 0.8256944444444444 | 3.525 |
| 0.8263888888888888 | 3.525 |
| 0.8270833333333334 | 3.525 |
| 0.8277777777777778 | 0 |
| 0.8284722222222222 | 0 |
| 0.8291666666666666 | 0 |
| 0.8298611111111112 | 0 |
| 0.8305555555555556 | 0 |
| 0.8312499999999999 | 0 |
| 0.8319444444444444 | 0 |
| 0.8326388888888889 | 0 |
| 0.8333333333333334 | 0 |
| 0.8340277777777777 | 0 |
| 0.8347222222222223 | 0 |
| 0.8354166666666667 | 0 |
| 0.8361111111111111 | 0 |
| 0.8368055555555555 | 0 |
| 0.8375 | 0 |
| 0.8381944444444445 | 0 |
| 0.8388888888888889 | 0 |
| 0.8395833333333332 | 0 |
| 0.8402777777777778 | 0 |
| 0.8409722222222222 | 0 |
| 0.8416666666666667 | 0 |
| 0.842361111111111 | 0 |
| 0.8430555555555556 | 0 |
| 0.84375 | 0 |
| 0.8444444444444444 | 0 |
| 0.845138888888889 | 0 |
| 0.8458333333333333 | 0 |
| 0.8465277777777778 | 0 |
| 0.8472222222222222 | 0 |
| 0.8479166666666668 | 0 |
| 0.8486111111111111 | 0 |
| 0.8493055555555555 | 0 |
| 0.85 | 0 |
| 0.8506944444444445 | 0 |
| 0.8513888888888889 | 0 |
| 0.8520833333333333 | 0 |
| 0.8527777777777777 | 0 |
| 0.8534722222222223 | 0 |
| 0.8541666666666666 | 0 |
| 0.8548611111111111 | 0 |
| 0.8555555555555556 | 0 |
| 0.8562500000000001 | 0 |
| 0.8569444444444444 | 0 |
| 0.8576388888888888 | 0 |
| 0.8583333333333334 | 0 |
| 0.8590277777777778 | 0 |
| 0.8597222222222222 | 0 |
| 0.8604166666666666 | 0 |
| 0.8611111111111112 | 0 |
| 0.8618055555555556 | 0 |
| 0.8624999999999999 | 0 |
| 0.8631944444444444 | 0 |
| 0.8638888888888889 | 0 |
| 0.8645833333333334 | 0 |
| 0.8652777777777777 | 0 |
| 0.8659722222222223 | 0 |
| 0.8666666666666667 | 0 |
| 0.8673611111111111 | 0 |
| 0.8680555555555555 | 0 |
| 0.86875 | 0 |
| 0.8694444444444445 | 0 |
| 0.8701388888888889 | 0 |
| 0.8708333333333332 | 0 |
| 0.8715277777777778 | 0 |
| 0.8722222222222222 | 0 |
| 0.8729166666666667 | 0 |
| 0.873611111111111 | 0 |
| 0.8743055555555556 | 0 |
| 0.875 | 0 |
| 0.8756944444444444 | 0 |
| 0.876388888888889 | 0 |
| 0.8770833333333333 | 0 |
| 0.8777777777777778 | 0 |
| 0.8784722222222222 | 0 |
| 0.8791666666666668 | 0 |
| 0.8798611111111111 | 0 |
| 0.8805555555555555 | 0 |
| 0.88125 | 0 |
| 0.8819444444444445 | 0 |
| 0.8826388888888889 | 0 |
| 0.8833333333333333 | 0 |
| 0.8840277777777777 | 0 |
| 0.8847222222222223 | 0 |
| 0.8854166666666666 | 0 |
| 0.8861111111111111 | 0 |
| 0.8868055555555556 | 0 |
| 0.8875000000000001 | 0 |
| 0.8881944444444444 | 0 |
| 0.8888888888888888 | 0 |
| 0.8895833333333334 | 0 |
| 0.8902777777777778 | 0 |
| 0.8909722222222222 | 0 |
| 0.8916666666666666 | 0 |
| 0.8923611111111112 | 0 |
| 0.8930555555555556 | 0 |
| 0.8937499999999999 | 0 |
| 0.8944444444444444 | 0 |
| 0.8951388888888889 | 0 |
| 0.8958333333333334 | 0 |
| 0.8965277777777777 | 0 |
| 0.8972222222222223 | 0 |
| 0.8979166666666667 | 0 |
| 0.8986111111111111 | 0 |
| 0.8993055555555555 | 0 |
| 0.9 | 0 |
| 0.9006944444444445 | 0 |
| 0.9013888888888889 | 0 |
| 0.9020833333333332 | 0 |
| 0.9027777777777778 | 0 |
| 0.9034722222222222 | 0 |
| 0.9041666666666667 | 0 |
| 0.904861111111111 | 0 |
| 0.9055555555555556 | 0 |
| 0.90625 | 0 |
| 0.9069444444444444 | 0 |
| 0.907638888888889 | 0 |
| 0.9083333333333333 | 0 |
| 0.9090277777777778 | 0 |
| 0.9097222222222222 | 0 |
| 0.9104166666666668 | 0 |
| 0.9111111111111111 | 0 |
| 0.9118055555555555 | 0 |
| 0.9125 | 0 |
| 0.9131944444444445 | 0 |
| 0.9138888888888889 | 0 |
| 0.9145833333333333 | 0 |
| 0.9152777777777777 | 0 |
| 0.9159722222222223 | 0 |
| 0.9166666666666666 | 0 |
| 0.9173611111111111 | 0 |
| 0.9180555555555556 | 0 |
| 0.9187500000000001 | 0 |
| 0.9194444444444444 | 0 |
| 0.9201388888888888 | 0 |
| 0.9208333333333334 | 0 |
| 0.9215277777777778 | 0 |
| 0.9222222222222222 | 0 |
| 0.9229166666666666 | 0 |
| 0.9236111111111112 | 0 |
| 0.9243055555555556 | 0 |
| 0.9249999999999999 | 0 |
| 0.9256944444444444 | 0 |
| 0.9263888888888889 | 0 |
| 0.9270833333333334 | 0 |
| 0.9277777777777777 | 0 |
| 0.9284722222222223 | 0 |
| 0.9291666666666667 | 0 |
| 0.9298611111111111 | 0 |
| 0.9305555555555555 | 0 |
| 0.93125 | 0 |
| 0.9319444444444445 | 0 |
| 0.9326388888888889 | 0 |
| 0.9333333333333332 | 0 |
| 0.9340277777777778 | 0 |
| 0.9347222222222222 | 0 |
| 0.9354166666666667 | 0 |
| 0.936111111111111 | 0 |
| 0.9368055555555556 | 0 |
| 0.9375 | 0 |
| 0.9381944444444444 | 0 |
| 0.938888888888889 | 0 |
| 0.9395833333333333 | 0 |
| 0.9402777777777778 | 0 |
| 0.9409722222222222 | 0 |
| 0.9416666666666668 | 0 |
| 0.9423611111111111 | 0 |
| 0.9430555555555555 | 0 |
| 0.94375 | 0 |
| 0.9444444444444445 | 0 |
| 0.9451388888888889 | 0 |
| 0.9458333333333333 | 0 |
| 0.9465277777777777 | 0 |
| 0.9472222222222223 | 0 |
| 0.9479166666666666 | 0 |
| 0.9486111111111111 | 0 |
| 0.9493055555555556 | 0 |
| 0.9500000000000001 | 0 |
| 0.9506944444444444 | 0 |
| 0.9513888888888888 | 0 |
| 0.9520833333333334 | 0 |
| 0.9527777777777778 | 0 |
| 0.9534722222222222 | 0 |
| 0.9541666666666666 | 0 |
| 0.9548611111111112 | 0 |
| 0.9555555555555556 | 0 |
| 0.9562499999999999 | 0 |
| 0.9569444444444444 | 0 |
| 0.9576388888888889 | 0 |
| 0.9583333333333334 | 0 |
| 0.9590277777777777 | 0 |
| 0.9597222222222223 | 0 |
| 0.9604166666666667 | 0 |
| 0.9611111111111111 | 0 |
| 0.9618055555555555 | 0 |
| 0.9625 | 0 |
| 0.9631944444444445 | 0 |
| 0.9638888888888889 | 0 |
| 0.9645833333333332 | 0 |
| 0.9652777777777778 | 0 |
| 0.9659722222222222 | 0 |
| 0.9666666666666667 | 0 |
| 0.967361111111111 | 0 |
| 0.9680555555555556 | 0 |
| 0.96875 | 0 |
| 0.9694444444444444 | 0 |
| 0.970138888888889 | 0 |
| 0.9708333333333333 | 0 |
| 0.9715277777777778 | 0 |
| 0.9722222222222222 | 0 |
| 0.9729166666666668 | 0 |
| 0.9736111111111111 | 0 |
| 0.9743055555555555 | 0 |
| 0.975 | 0 |
| 0.9756944444444445 | 0 |
| 0.9763888888888889 | 0 |
| 0.9770833333333333 | 0 |
| 0.9777777777777777 | 0 |
| 0.9784722222222223 | 0 |
| 0.9791666666666666 | 0 |
| 0.9798611111111111 | 0 |
| 0.9805555555555556 | 0 |
| 0.9812500000000001 | 0 |
| 0.9819444444444444 | 0 |
| 0.9826388888888888 | 0 |
| 0.9833333333333334 | 0 |
| 0.9840277777777778 | 0 |
| 0.9847222222222222 | 0 |
| 0.9854166666666666 | 0 |
| 0.9861111111111112 | 0 |
| 0.9868055555555556 | 0 |
| 0.9874999999999999 | 0 |
| 0.9881944444444444 | 0 |
| 0.9888888888888889 | 0 |
| 0.9895833333333334 | 0 |
| 0.9902777777777777 | 0 |
| 0.9909722222222223 | 0 |
| 0.9916666666666667 | 0 |
| 0.9923611111111111 | 0 |
| 0.9930555555555555 | 0 |
| 0.99375 | 0 |
| 0.9944444444444445 | 0 |
| 0.9951388888888889 | 0 |
| 0.9958333333333332 | 0 |
| 0.9965277777777778 | 0 |
| 0.9972222222222222 | 0 |
| 0.9979166666666667 | 0 |
| 0.998611111111111 | 0 |
| 0.9993055555555556 | 0 |